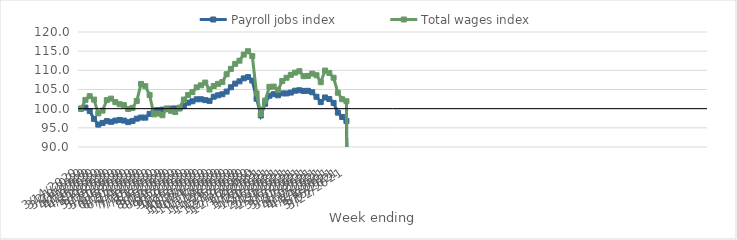
| Category | Payroll jobs index | Total wages index |
|---|---|---|
| 14/03/2020 | 100 | 100 |
| 21/03/2020 | 100.284 | 102.283 |
| 28/03/2020 | 99.37 | 103.269 |
| 04/04/2020 | 97.328 | 102.363 |
| 11/04/2020 | 95.836 | 98.771 |
| 18/04/2020 | 96.275 | 99.49 |
| 25/04/2020 | 96.759 | 102.238 |
| 02/05/2020 | 96.566 | 102.621 |
| 09/05/2020 | 96.886 | 101.706 |
| 16/05/2020 | 97.064 | 101.167 |
| 23/05/2020 | 96.892 | 100.925 |
| 30/05/2020 | 96.486 | 99.927 |
| 06/06/2020 | 96.8 | 100.195 |
| 13/06/2020 | 97.389 | 102.018 |
| 20/06/2020 | 97.685 | 106.458 |
| 27/06/2020 | 97.66 | 105.863 |
| 04/07/2020 | 98.65 | 103.572 |
| 11/07/2020 | 99.552 | 98.508 |
| 18/07/2020 | 99.607 | 98.714 |
| 25/07/2020 | 99.749 | 98.291 |
| 01/08/2020 | 99.856 | 100.057 |
| 08/08/2020 | 100.015 | 99.43 |
| 15/08/2020 | 100.056 | 99.132 |
| 22/08/2020 | 100.059 | 100.263 |
| 29/08/2020 | 100.681 | 102.372 |
| 05/09/2020 | 101.574 | 103.566 |
| 12/09/2020 | 101.928 | 104.323 |
| 19/09/2020 | 102.441 | 105.562 |
| 26/09/2020 | 102.464 | 106.1 |
| 03/10/2020 | 102.231 | 106.806 |
| 10/10/2020 | 102.036 | 104.99 |
| 17/10/2020 | 103.121 | 105.91 |
| 24/10/2020 | 103.491 | 106.477 |
| 31/10/2020 | 103.763 | 106.936 |
| 07/11/2020 | 104.454 | 108.984 |
| 14/11/2020 | 105.581 | 110.37 |
| 21/11/2020 | 106.533 | 111.689 |
| 28/11/2020 | 107.131 | 112.512 |
| 05/12/2020 | 107.906 | 114.104 |
| 12/12/2020 | 108.229 | 114.982 |
| 19/12/2020 | 107.331 | 113.715 |
| 26/12/2020 | 102.593 | 103.97 |
| 02/01/2021 | 98.227 | 98.556 |
| 09/01/2021 | 101.301 | 102.107 |
| 16/01/2021 | 103.368 | 105.707 |
| 23/01/2021 | 103.787 | 105.757 |
| 30/01/2021 | 103.489 | 104.847 |
| 06/02/2021 | 103.979 | 107.196 |
| 13/02/2021 | 103.973 | 108.063 |
| 20/02/2021 | 104.2 | 108.818 |
| 27/02/2021 | 104.682 | 109.407 |
| 06/03/2021 | 104.804 | 109.784 |
| 13/03/2021 | 104.625 | 108.463 |
| 20/03/2021 | 104.657 | 108.54 |
| 27/03/2021 | 104.29 | 109.142 |
| 03/04/2021 | 103.106 | 108.725 |
| 10/04/2021 | 101.708 | 106.918 |
| 17/04/2021 | 102.925 | 109.936 |
| 24/04/2021 | 102.501 | 109.324 |
| 01/05/2021 | 101.504 | 108.058 |
| 08/05/2021 | 98.968 | 104.144 |
| 15/05/2021 | 97.835 | 102.474 |
| 22/05/2021 | 96.786 | 101.943 |